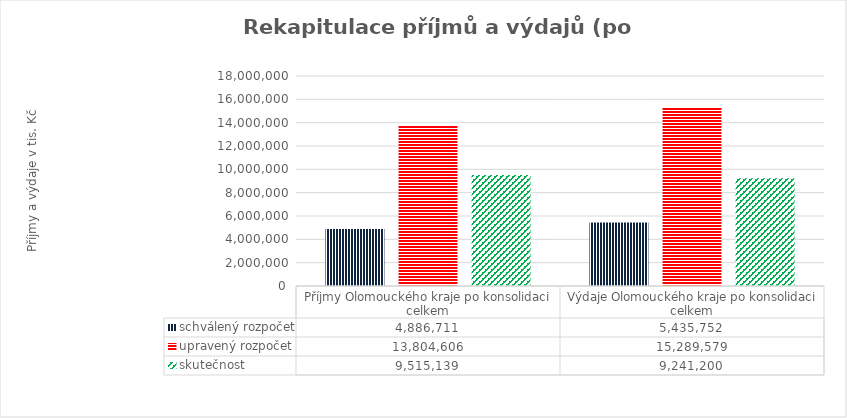
| Category | schválený rozpočet | upravený rozpočet | skutečnost |
|---|---|---|---|
| Příjmy Olomouckého kraje po konsolidaci celkem | 4886711 | 13804606 | 9515139 |
| Výdaje Olomouckého kraje po konsolidaci celkem | 5435752 | 15289579 | 9241200 |